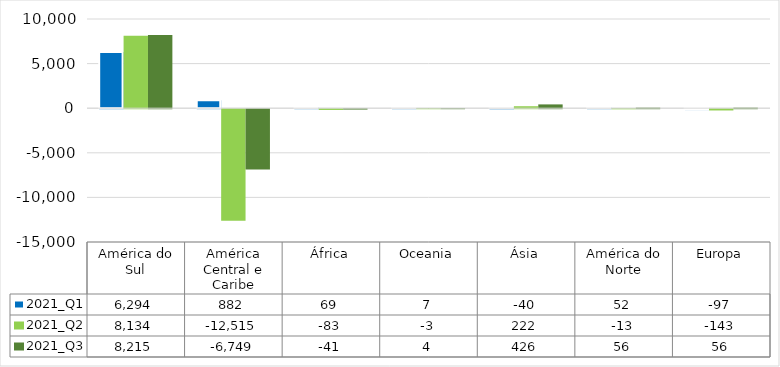
| Category | 2021_Q1 | 2021_Q2 | 2021_Q3 |
|---|---|---|---|
| América do Sul | 6294 | 8134 | 8215 |
| América Central e Caribe | 882 | -12515 | -6749 |
| África | 69 | -83 | -41 |
| Oceania | 7 | -3 | 4 |
| Ásia | -40 | 222 | 426 |
| América do Norte | 52 | -13 | 56 |
| Europa | -97 | -143 | 56 |